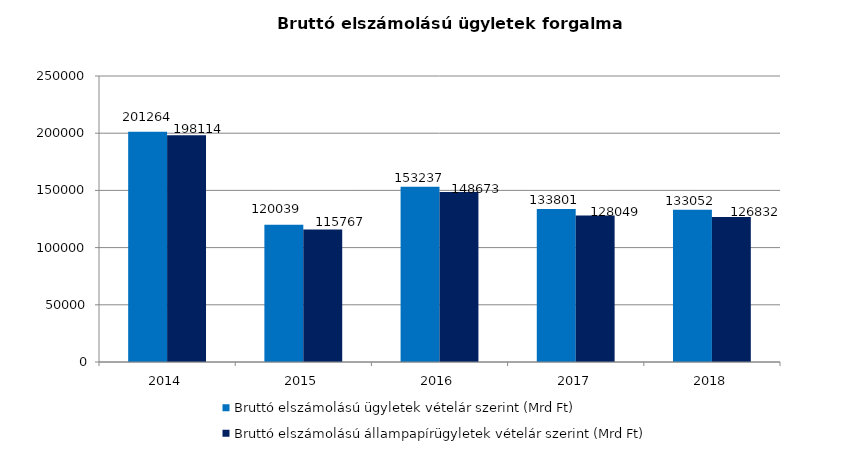
| Category | Bruttó elszámolású ügyletek vételár szerint (Mrd Ft) | Bruttó elszámolású állampapírügyletek vételár szerint (Mrd Ft) |
|---|---|---|
| 2014.0 | 201264 | 198114 |
| 2015.0 | 120039 | 115767 |
| 2016.0 | 153237 | 148673 |
| 2017.0 | 133801 | 128049 |
| 2018.0 | 133052 | 126832 |